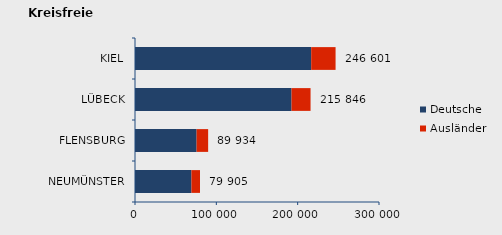
| Category | Deutsche | Ausländer | Series 2 |
|---|---|---|---|
| NEUMÜNSTER | 69382 | 10523 | 79905 |
| FLENSBURG | 75732 | 14202 | 89934 |
| LÜBECK | 192454 | 23392 | 215846 |
| KIEL | 216633 | 29968 | 246601 |